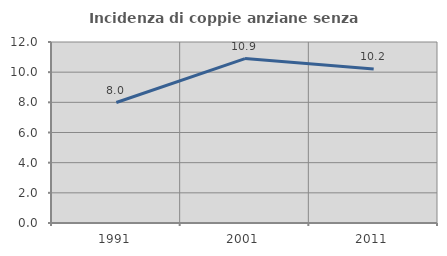
| Category | Incidenza di coppie anziane senza figli  |
|---|---|
| 1991.0 | 7.986 |
| 2001.0 | 10.902 |
| 2011.0 | 10.213 |